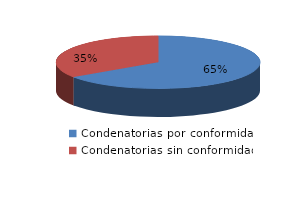
| Category | Series 0 |
|---|---|
| 0 | 36 |
| 1 | 19 |